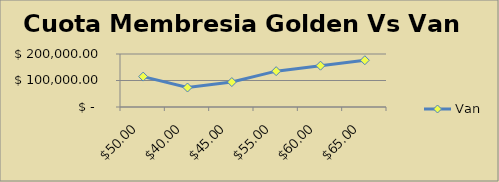
| Category | Van |
|---|---|
| 50.0 | 114699.073 |
| 40.0 | 73501.741 |
| 45.0 | 94100.407 |
| 55.0 | 135297.739 |
| 60.0 | 155896.404 |
| 65.0 | 176495.07 |